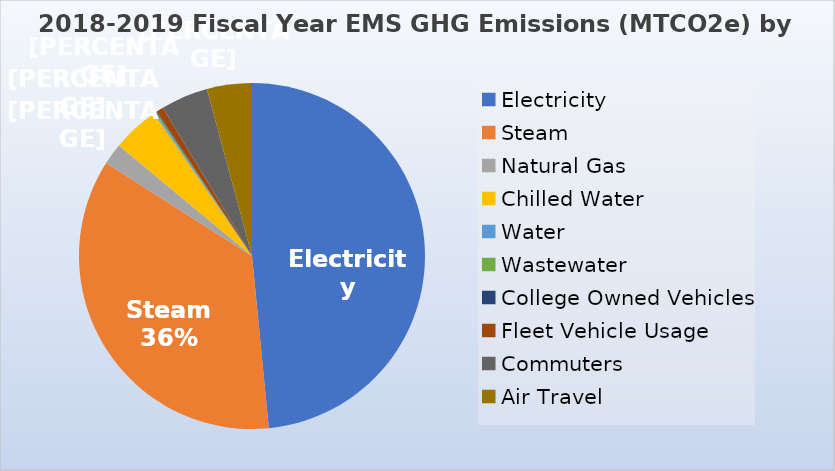
| Category | Series 0 |
|---|---|
| Electricity | 5057.5 |
| Steam | 3714.577 |
| Natural Gas | 209.521 |
| Chilled Water | 457.468 |
| Water | 13.456 |
| Wastewater | 13.088 |
| College Owned Vehicles | 7.184 |
| Fleet Vehicle Usage | 68.028 |
| Commuters | 460.634 |
| Air Travel | 438.132 |